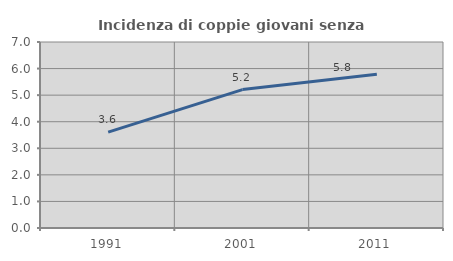
| Category | Incidenza di coppie giovani senza figli |
|---|---|
| 1991.0 | 3.608 |
| 2001.0 | 5.208 |
| 2011.0 | 5.789 |